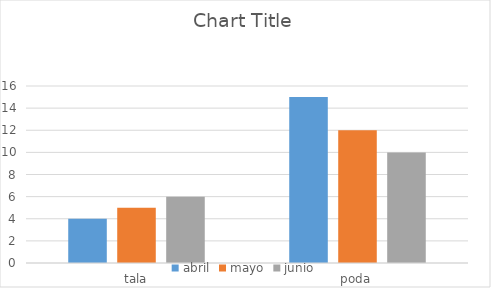
| Category | abril | mayo | junio |
|---|---|---|---|
| tala | 4 | 5 | 6 |
| poda | 15 | 12 | 10 |